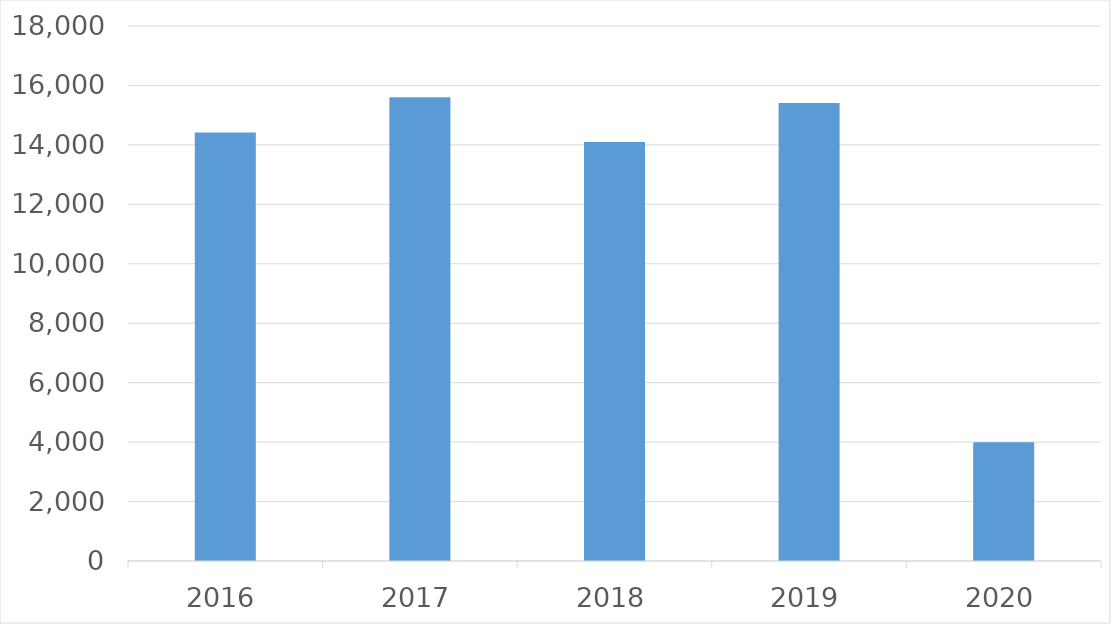
| Category | Series 0 |
|---|---|
| 2016 | 14417 |
| 2017 | 15601 |
| 2018 | 14100 |
| 2019 | 15411 |
| 2020 | 3994 |